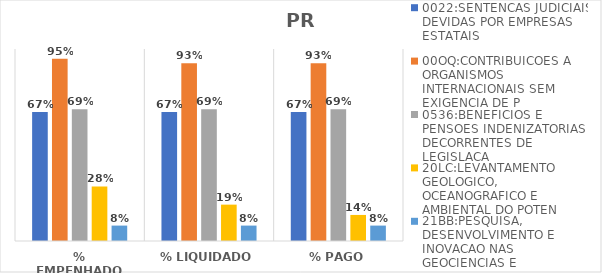
| Category | 0022:SENTENCAS JUDICIAIS DEVIDAS POR EMPRESAS ESTATAIS | 00OQ:CONTRIBUICOES A ORGANISMOS INTERNACIONAIS SEM EXIGENCIA DE P | 0536:BENEFICIOS E PENSOES INDENIZATORIAS DECORRENTES DE LEGISLACA | 20LC:LEVANTAMENTO GEOLOGICO, OCEANOGRAFICO E AMBIENTAL DO POTEN | 21BB:PESQUISA, DESENVOLVIMENTO E INOVACAO NAS GEOCIENCIAS E |
|---|---|---|---|---|---|
| % EMPENHADO | 0.671 | 0.95 | 0.687 | 0.284 | 0.08 |
| % LIQUIDADO | 0.671 | 0.926 | 0.687 | 0.189 | 0.08 |
| % PAGO | 0.671 | 0.926 | 0.687 | 0.136 | 0.08 |